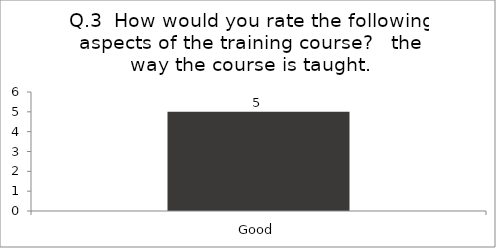
| Category | Q.3  How would you rate the following aspects of the training course?  |
|---|---|
| Good | 5 |